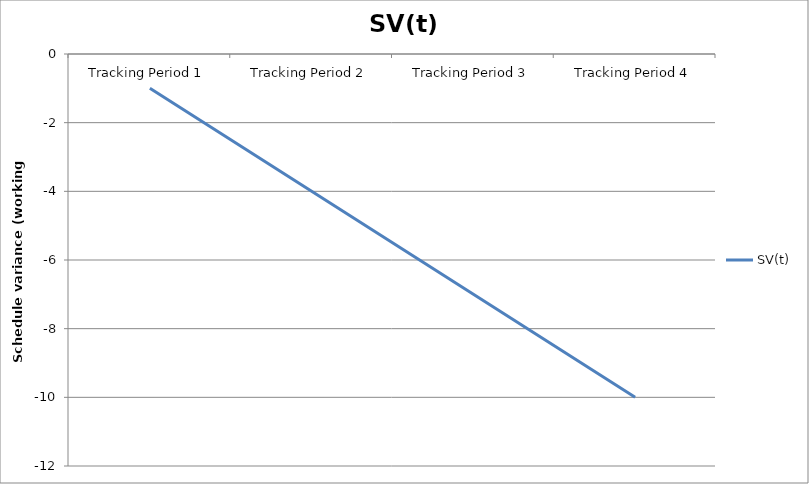
| Category | SV(t) |
|---|---|
| Tracking Period 1 | -1 |
| Tracking Period 2 | -4 |
| Tracking Period 3 | -7 |
| Tracking Period 4 | -10 |